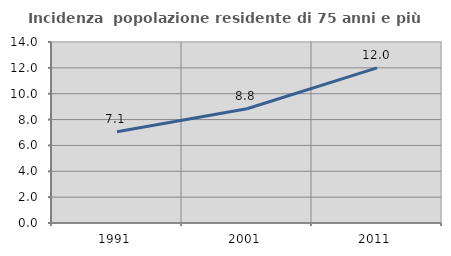
| Category | Incidenza  popolazione residente di 75 anni e più |
|---|---|
| 1991.0 | 7.06 |
| 2001.0 | 8.84 |
| 2011.0 | 12 |